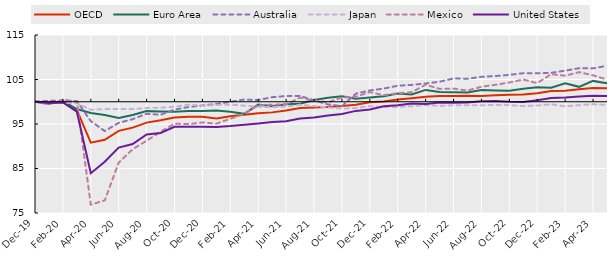
| Category | OECD | Euro Area | Australia | Japan | Mexico | United States |
|---|---|---|---|---|---|---|
| 2019-12-01 | 100 | 100 | 100 | 100 | 100 | 100 |
| 2020-01-01 | 99.913 | 99.535 | 100.22 | 99.794 | 99.453 | 99.743 |
| 2020-02-01 | 99.902 | 100.158 | 100.192 | 99.764 | 100.468 | 99.831 |
| 2020-03-01 | 98.151 | 98.37 | 100.157 | 99.661 | 100.099 | 97.759 |
| 2020-04-01 | 90.812 | 97.486 | 95.65 | 98.201 | 76.878 | 83.939 |
| 2020-05-01 | 91.453 | 97.019 | 93.409 | 98.364 | 77.842 | 86.521 |
| 2020-06-01 | 93.452 | 96.333 | 95.263 | 98.378 | 86.319 | 89.687 |
| 2020-07-01 | 94.189 | 97.031 | 96.09 | 98.349 | 89.328 | 90.49 |
| 2020-08-01 | 95.309 | 97.893 | 97.296 | 98.585 | 91.239 | 92.665 |
| 2020-09-01 | 95.833 | 97.816 | 97.075 | 98.658 | 93.243 | 92.999 |
| 2020-10-01 | 96.462 | 97.743 | 98.249 | 98.894 | 95.072 | 94.356 |
| 2020-11-01 | 96.62 | 97.923 | 98.803 | 99.351 | 94.972 | 94.382 |
| 2020-12-01 | 96.624 | 97.93 | 99.174 | 99.101 | 95.344 | 94.4 |
| 2021-01-01 | 96.227 | 98.025 | 99.506 | 99.278 | 95.078 | 94.326 |
| 2021-02-01 | 96.727 | 97.763 | 99.987 | 99.351 | 96.169 | 94.531 |
| 2021-03-01 | 97.063 | 97.282 | 100.499 | 99.13 | 97.3 | 94.846 |
| 2021-04-01 | 97.396 | 99.351 | 100.388 | 98.865 | 99.212 | 95.137 |
| 2021-05-01 | 97.613 | 98.975 | 101.031 | 98.806 | 99.328 | 95.469 |
| 2021-06-01 | 98.024 | 99.461 | 101.281 | 98.924 | 99.401 | 95.614 |
| 2021-07-01 | 98.608 | 99.564 | 101.316 | 99.322 | 100.916 | 96.215 |
| 2021-08-01 | 98.713 | 100.406 | 100.322 | 99.042 | 100.302 | 96.479 |
| 2021-09-01 | 98.824 | 100.922 | 99.397 | 98.717 | 99.867 | 96.912 |
| 2021-10-01 | 99.041 | 101.211 | 99.011 | 98.467 | 100.96 | 97.264 |
| 2021-11-01 | 99.342 | 100.681 | 101.825 | 98.57 | 101.134 | 97.948 |
| 2021-12-01 | 99.884 | 100.964 | 102.536 | 99.027 | 102.168 | 98.264 |
| 2022-01-01 | 100.082 | 101.245 | 102.967 | 98.806 | 101.482 | 98.984 |
| 2022-02-01 | 100.482 | 101.861 | 103.599 | 98.85 | 101.919 | 99.227 |
| 2022-03-01 | 100.8 | 101.629 | 103.784 | 98.997 | 102.148 | 99.589 |
| 2022-04-01 | 101.144 | 102.658 | 104.113 | 99.233 | 103.833 | 99.506 |
| 2022-05-01 | 101.283 | 102.195 | 104.497 | 99.086 | 102.889 | 99.824 |
| 2022-06-01 | 101.268 | 102.122 | 105.231 | 99.204 | 102.952 | 99.754 |
| 2022-07-01 | 101.356 | 102.092 | 105.173 | 99.233 | 102.511 | 99.851 |
| 2022-08-01 | 101.279 | 102.621 | 105.607 | 99.189 | 103.382 | 100.09 |
| 2022-09-01 | 101.462 | 102.539 | 105.781 | 99.307 | 103.804 | 100.154 |
| 2022-10-01 | 101.573 | 102.482 | 106.028 | 99.233 | 104.321 | 100.001 |
| 2022-11-01 | 101.648 | 102.939 | 106.425 | 99.027 | 104.996 | 99.941 |
| 2022-12-01 | 101.905 | 103.231 | 106.392 | 99.16 | 104.189 | 100.357 |
| 2023-01-01 | 102.432 | 103.148 | 106.509 | 99.425 | 106.201 | 100.824 |
| 2023-02-01 | 102.462 | 104.153 | 106.988 | 98.983 | 105.848 | 100.954 |
| 2023-03-01 | 102.784 | 103.353 | 107.534 | 99.233 | 106.658 | 101.169 |
| 2023-04-01 | 103.065 | 104.687 | 107.503 | 99.425 | 105.937 | 101.337 |
| 2023-05-01 | 103.059 | 104.148 | 108.089 | 99.307 | 104.99 | 101.288 |